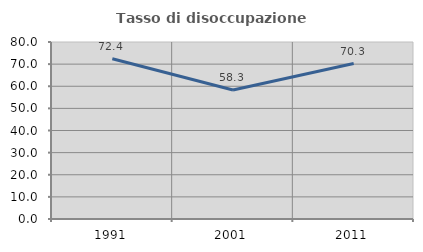
| Category | Tasso di disoccupazione giovanile  |
|---|---|
| 1991.0 | 72.414 |
| 2001.0 | 58.333 |
| 2011.0 | 70.27 |